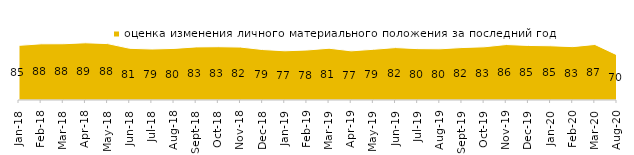
| Category | оценка изменения личного материального положения за последний год |
|---|---|
| 2018-01-01 | 85.15 |
| 2018-02-01 | 87.55 |
| 2018-03-01 | 87.65 |
| 2018-04-01 | 89.15 |
| 2018-05-01 | 87.9 |
| 2018-06-01 | 80.55 |
| 2018-07-01 | 79.45 |
| 2018-08-01 | 80.4 |
| 2018-09-01 | 82.75 |
| 2018-10-01 | 83.05 |
| 2018-11-01 | 82.485 |
| 2018-12-01 | 78.65 |
| 2019-01-01 | 76.7 |
| 2019-02-01 | 77.9 |
| 2019-03-01 | 80.656 |
| 2019-04-01 | 76.584 |
| 2019-05-01 | 79 |
| 2019-06-01 | 81.696 |
| 2019-07-01 | 80.05 |
| 2019-08-01 | 79.77 |
| 2019-09-01 | 81.733 |
| 2019-10-01 | 82.871 |
| 2019-11-01 | 86.436 |
| 2019-12-01 | 85 |
| 2020-01-01 | 84.505 |
| 2020-02-01 | 83.168 |
| 2020-03-01 | 86.564 |
| 2020-08-01 | 70.357 |